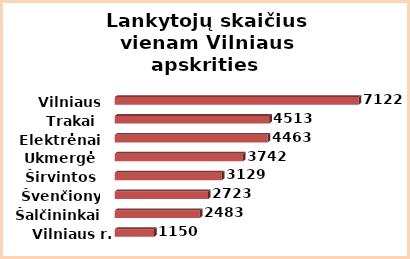
| Category | Series 0 |
|---|---|
| Vilniaus r. | 1150 |
| Šalčininkai | 2483 |
| Švenčionys | 2723 |
| Širvintos | 3129 |
| Ukmergė | 3742 |
| Elektrėnai | 4463 |
| Trakai | 4513 |
| Vilniaus m. | 7122 |